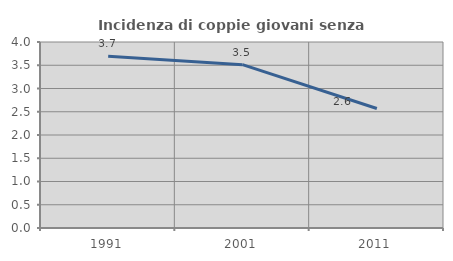
| Category | Incidenza di coppie giovani senza figli |
|---|---|
| 1991.0 | 3.694 |
| 2001.0 | 3.513 |
| 2011.0 | 2.57 |